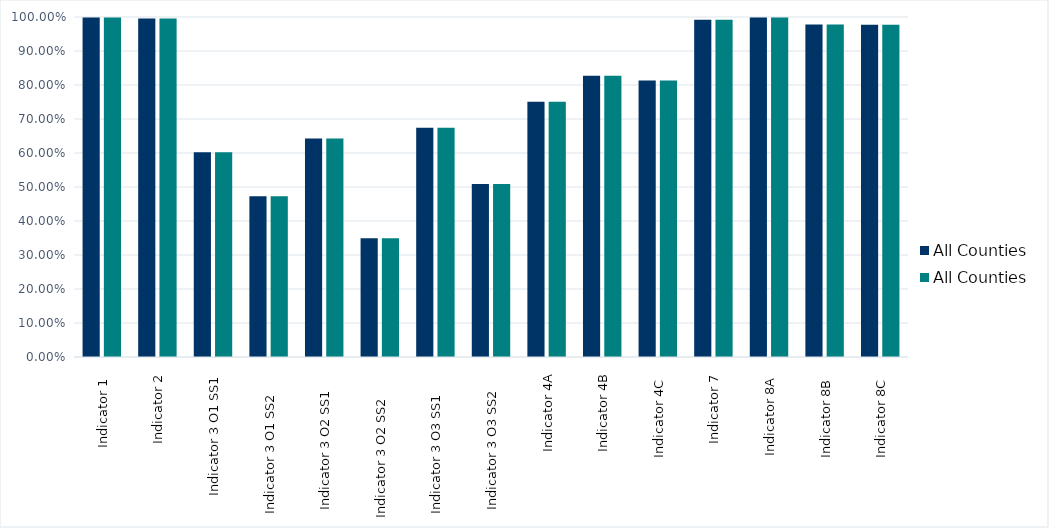
| Category | All Counties |
|---|---|
| Indicator 1  | 0.998 |
| Indicator 2 | 0.996 |
| Indicator 3 O1 SS1 | 0.602 |
| Indicator 3 O1 SS2     | 0.473 |
| Indicator 3 O2 SS1    | 0.643 |
| Indicator 3 O2 SS2      | 0.349 |
| Indicator 3 O3 SS1     | 0.674 |
| Indicator 3 O3 SS2    | 0.509 |
| Indicator 4A | 0.751 |
| Indicator 4B | 0.828 |
| Indicator 4C  | 0.814 |
| Indicator 7 | 0.992 |
| Indicator 8A  | 0.999 |
| Indicator 8B  | 0.978 |
| Indicator 8C  | 0.977 |